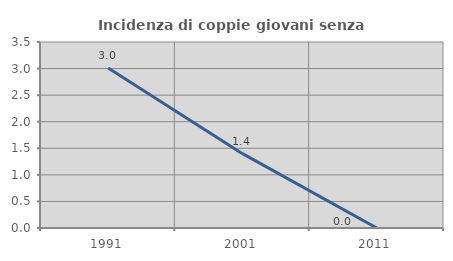
| Category | Incidenza di coppie giovani senza figli |
|---|---|
| 1991.0 | 3.012 |
| 2001.0 | 1.399 |
| 2011.0 | 0 |